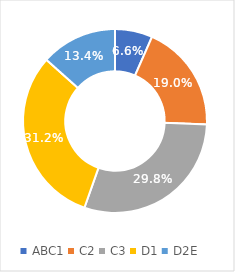
| Category | Series 0 |
|---|---|
| ABC1 | 0.066 |
| C2 | 0.19 |
| C3 | 0.298 |
| D1 | 0.312 |
| D2E | 0.134 |